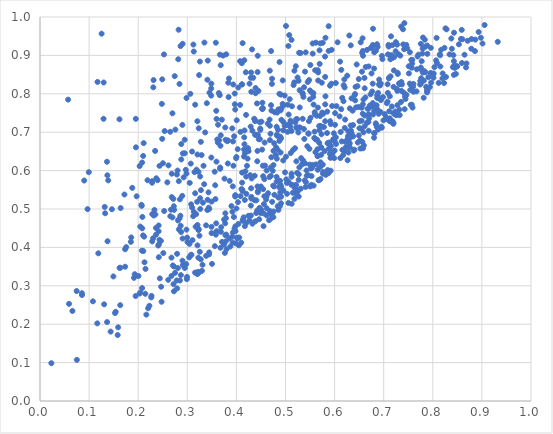
| Category | Series 0 |
|---|---|
| 0.3241826572381302 | 0.335 |
| 0.35943914082320505 | 0.623 |
| 0.7320326716899943 | 0.759 |
| 0.4909191485191038 | 0.515 |
| 0.7139500921506526 | 0.845 |
| 0.17553779853532225 | 0.401 |
| 0.543216185961203 | 0.587 |
| 0.7064448453857968 | 0.775 |
| 0.38278672243462475 | 0.679 |
| 0.30679952129831023 | 0.38 |
| 0.3169270997529283 | 0.454 |
| 0.5728964879675177 | 0.66 |
| 0.19294451869547558 | 0.33 |
| 0.7200454432876707 | 0.818 |
| 0.43267757560375997 | 0.462 |
| 0.5883850561728835 | 0.657 |
| 0.6134871844233055 | 0.76 |
| 0.3589021592761066 | 0.463 |
| 0.14386874915960468 | 0.181 |
| 0.4309821267858086 | 0.58 |
| 0.08540787262710192 | 0.281 |
| 0.36470227393187504 | 0.679 |
| 0.3494523866823751 | 0.437 |
| 0.06604621093850571 | 0.234 |
| 0.6846551922902698 | 0.72 |
| 0.6842214321963571 | 0.912 |
| 0.13662077026407937 | 0.206 |
| 0.6864666068234506 | 0.929 |
| 0.7134935111356105 | 0.899 |
| 0.27191063807600646 | 0.304 |
| 0.6588241501385045 | 0.785 |
| 0.5984386878877718 | 0.697 |
| 0.394934147082889 | 0.479 |
| 0.2902449224560274 | 0.365 |
| 0.43041418270860243 | 0.532 |
| 0.6257251340946023 | 0.847 |
| 0.7763490728289525 | 0.841 |
| 0.4819970509914826 | 0.572 |
| 0.09682463340321523 | 0.5 |
| 0.6518856142961246 | 0.678 |
| 0.7175616406374252 | 0.927 |
| 0.2683598522995426 | 0.531 |
| 0.30707401395662204 | 0.618 |
| 0.7284815163905518 | 0.746 |
| 0.7794407426993887 | 0.918 |
| 0.6039012955829326 | 0.768 |
| 0.3298055551551954 | 0.339 |
| 0.4545789864268118 | 0.585 |
| 0.4523891559498634 | 0.655 |
| 0.2362721393551751 | 0.451 |
| 0.2841078757293837 | 0.826 |
| 0.6776270733750223 | 0.826 |
| 0.5495888155398727 | 0.785 |
| 0.48573668738135845 | 0.53 |
| 0.24164016768497132 | 0.457 |
| 0.8487230886286082 | 0.872 |
| 0.5131702470108969 | 0.767 |
| 0.8377310728050598 | 0.944 |
| 0.7231327528418295 | 0.747 |
| 0.6426934928060217 | 0.818 |
| 0.44339780883575586 | 0.899 |
| 0.2827507910456427 | 0.447 |
| 0.23148482045482233 | 0.483 |
| 0.5866617593635869 | 0.672 |
| 0.6437193347377128 | 0.765 |
| 0.4583101829385514 | 0.613 |
| 0.652590495293859 | 0.658 |
| 0.5656036972357789 | 0.602 |
| 0.3853952361526052 | 0.423 |
| 0.21009920451461428 | 0.638 |
| 0.5409855531365229 | 0.557 |
| 0.8589589464240803 | 0.966 |
| 0.49117956500907334 | 0.532 |
| 0.5747755845747592 | 0.751 |
| 0.15821562117675259 | 0.172 |
| 0.6307564224063056 | 0.671 |
| 0.11708615925991162 | 0.831 |
| 0.47185384485158477 | 0.477 |
| 0.6215571550748945 | 0.733 |
| 0.5200947401573266 | 0.556 |
| 0.6855784723082043 | 0.77 |
| 0.4459318768912177 | 0.553 |
| 0.2488530643220146 | 0.683 |
| 0.6229684678610061 | 0.661 |
| 0.6883439693966587 | 0.755 |
| 0.6985694362016511 | 0.791 |
| 0.8084421023379886 | 0.88 |
| 0.46906283870365917 | 0.49 |
| 0.5846668293358934 | 0.698 |
| 0.5857009786050621 | 0.671 |
| 0.7604939611074603 | 0.826 |
| 0.8280401748681426 | 0.968 |
| 0.5686999092051592 | 0.672 |
| 0.24896352705775648 | 0.838 |
| 0.3568733139873371 | 0.562 |
| 0.45701372724662914 | 0.533 |
| 0.43622897879704237 | 0.735 |
| 0.23499736599163967 | 0.486 |
| 0.4464250634227528 | 0.473 |
| 0.5349864197972677 | 0.735 |
| 0.2977862816877459 | 0.357 |
| 0.3145855473004784 | 0.596 |
| 0.7135110876023892 | 0.89 |
| 0.5704036988670822 | 0.742 |
| 0.7579384403388559 | 0.879 |
| 0.5901671333909653 | 0.673 |
| 0.7324927742681306 | 0.744 |
| 0.42160699653445677 | 0.612 |
| 0.3408274504015446 | 0.497 |
| 0.6608908827755022 | 0.841 |
| 0.29910390936076514 | 0.317 |
| 0.2859113534807829 | 0.483 |
| 0.4165477384243287 | 0.705 |
| 0.43255792780822666 | 0.704 |
| 0.2948810911885892 | 0.645 |
| 0.15291289288891463 | 0.229 |
| 0.5193951565545566 | 0.658 |
| 0.4616078856386605 | 0.502 |
| 0.8497440962434404 | 0.871 |
| 0.4303740629220062 | 0.805 |
| 0.536539827172495 | 0.792 |
| 0.20660107080165513 | 0.511 |
| 0.3441968549566693 | 0.382 |
| 0.4705259441677424 | 0.77 |
| 0.726283129269042 | 0.751 |
| 0.5552594698605303 | 0.615 |
| 0.56860413019261 | 0.716 |
| 0.3078456778790343 | 0.512 |
| 0.4749830565842864 | 0.561 |
| 0.12968161475220374 | 0.829 |
| 0.1913835749504963 | 0.321 |
| 0.6061062655337774 | 0.934 |
| 0.44860766155624077 | 0.71 |
| 0.5047891168790143 | 0.772 |
| 0.5693094462080407 | 0.913 |
| 0.2612154428986535 | 0.316 |
| 0.7569943837092026 | 0.868 |
| 0.2877645338291288 | 0.629 |
| 0.42999779824606055 | 0.855 |
| 0.6930575016696245 | 0.753 |
| 0.7864862674998488 | 0.818 |
| 0.7050975734124593 | 0.734 |
| 0.5220633586517358 | 0.713 |
| 0.23957755193304864 | 0.575 |
| 0.7352292083773888 | 0.779 |
| 0.5307488198779351 | 0.906 |
| 0.41612105644409214 | 0.887 |
| 0.5506362305098268 | 0.875 |
| 0.5906039390142854 | 0.821 |
| 0.32113508124688916 | 0.332 |
| 0.3131842646988878 | 0.493 |
| 0.3676109879234828 | 0.665 |
| 0.4291279825481712 | 0.715 |
| 0.6739326111744868 | 0.92 |
| 0.5501423431132537 | 0.559 |
| 0.5117547141331752 | 0.563 |
| 0.5209696768910705 | 0.872 |
| 0.39269639092047137 | 0.439 |
| 0.3935725408947701 | 0.824 |
| 0.43906726993847944 | 0.815 |
| 0.5239658617765203 | 0.547 |
| 0.6886446685259877 | 0.802 |
| 0.6309803259798191 | 0.762 |
| 0.12546493012421112 | 0.957 |
| 0.2793576031691365 | 0.293 |
| 0.5267768751296757 | 0.576 |
| 0.32276687803356596 | 0.445 |
| 0.41263237281253373 | 0.932 |
| 0.23130438620122873 | 0.836 |
| 0.4171099453574988 | 0.523 |
| 0.334854104228515 | 0.933 |
| 0.44291865836082944 | 0.559 |
| 0.4700622055795819 | 0.586 |
| 0.5923596805880003 | 0.664 |
| 0.5221343931347345 | 0.624 |
| 0.8149126940895356 | 0.9 |
| 0.8676908987760715 | 0.869 |
| 0.47143996782322417 | 0.756 |
| 0.6366799312255437 | 0.756 |
| 0.6866290571697985 | 0.796 |
| 0.6812924699597956 | 0.697 |
| 0.4294815236345402 | 0.483 |
| 0.21284072983722113 | 0.361 |
| 0.26779261023095435 | 0.373 |
| 0.4913186301863245 | 0.559 |
| 0.4131008961982351 | 0.472 |
| 0.5524088936581311 | 0.561 |
| 0.35925855978800336 | 0.441 |
| 0.5795788457602404 | 0.651 |
| 0.2307482590133605 | 0.817 |
| 0.7110427925715185 | 0.842 |
| 0.6733299772849143 | 0.768 |
| 0.6000489418035074 | 0.652 |
| 0.7052556085671682 | 0.738 |
| 0.3206191841171625 | 0.642 |
| 0.6101345654715006 | 0.741 |
| 0.2843270986036993 | 0.476 |
| 0.32328485444616195 | 0.71 |
| 0.4943026595746979 | 0.835 |
| 0.41126079811931426 | 0.825 |
| 0.753315874642528 | 0.908 |
| 0.8268022229061012 | 0.844 |
| 0.5695989068954492 | 0.878 |
| 0.3227924348818557 | 0.597 |
| 0.16372174627160463 | 0.347 |
| 0.5265918423639195 | 0.834 |
| 0.1372120218635723 | 0.588 |
| 0.5878526564673584 | 0.976 |
| 0.09937276154655517 | 0.596 |
| 0.5592054253627353 | 0.701 |
| 0.5706713917043384 | 0.931 |
| 0.49007021191128375 | 0.757 |
| 0.6692722724264102 | 0.747 |
| 0.5063580355874711 | 0.57 |
| 0.5540058314655582 | 0.611 |
| 0.47281200208135676 | 0.519 |
| 0.6328623902945344 | 0.926 |
| 0.6350933942993762 | 0.692 |
| 0.6838543954463874 | 0.723 |
| 0.25286506445130086 | 0.495 |
| 0.3967972019018391 | 0.773 |
| 0.6171857456408648 | 0.64 |
| 0.7893406266849216 | 0.808 |
| 0.40373998124124777 | 0.816 |
| 0.7362043272267517 | 0.808 |
| 0.417460147173228 | 0.645 |
| 0.21490514222184343 | 0.344 |
| 0.7446548253464573 | 0.919 |
| 0.6402561556451217 | 0.655 |
| 0.637908081725462 | 0.689 |
| 0.8068449401306811 | 0.887 |
| 0.34097475467742466 | 0.837 |
| 0.05913192137283163 | 0.253 |
| 0.5086171319150498 | 0.786 |
| 0.775653661250402 | 0.869 |
| 0.6206575907134803 | 0.711 |
| 0.6531479664896472 | 0.934 |
| 0.6300182538397123 | 0.67 |
| 0.5268949635798933 | 0.532 |
| 0.5529142132754882 | 0.563 |
| 0.6778593471768933 | 0.776 |
| 0.5636938347431009 | 0.743 |
| 0.48277191709637635 | 0.691 |
| 0.5642276067475817 | 0.68 |
| 0.4884770725136859 | 0.507 |
| 0.38350892277700843 | 0.829 |
| 0.695003581887999 | 0.714 |
| 0.8442462063230808 | 0.874 |
| 0.2079124518885045 | 0.294 |
| 0.602460678755261 | 0.828 |
| 0.7884859155847298 | 0.926 |
| 0.8409640050778232 | 0.869 |
| 0.4960788861695947 | 0.77 |
| 0.7582327751080475 | 0.888 |
| 0.3939131081039642 | 0.613 |
| 0.8933760427127276 | 0.961 |
| 0.7795007914380815 | 0.855 |
| 0.3747208256456246 | 0.407 |
| 0.5949057224382441 | 0.768 |
| 0.680511136643269 | 0.756 |
| 0.0854729130338393 | 0.276 |
| 0.8077140862419002 | 0.946 |
| 0.33433252473268915 | 0.565 |
| 0.29256988508935977 | 0.582 |
| 0.4498728907601225 | 0.559 |
| 0.30621024241046635 | 0.8 |
| 0.6465334255306514 | 0.82 |
| 0.6694013405060258 | 0.871 |
| 0.5249591389600544 | 0.546 |
| 0.37799632894521773 | 0.68 |
| 0.7311127177084753 | 0.827 |
| 0.7397303236541029 | 0.929 |
| 0.40408319135985216 | 0.461 |
| 0.3160529803096931 | 0.772 |
| 0.5075548657833875 | 0.953 |
| 0.6272505175626626 | 0.69 |
| 0.3626335562831685 | 0.719 |
| 0.8388760494513026 | 0.917 |
| 0.27885094745790395 | 0.59 |
| 0.7674192600343356 | 0.864 |
| 0.19686821602242988 | 0.533 |
| 0.411125689455872 | 0.88 |
| 0.7207072321551181 | 0.861 |
| 0.5554244517903073 | 0.905 |
| 0.7359351642296017 | 0.831 |
| 0.4752097624676991 | 0.479 |
| 0.3099358922215333 | 0.504 |
| 0.4425250402281449 | 0.624 |
| 0.7421319664029522 | 0.984 |
| 0.5879147553852088 | 0.912 |
| 0.7101037655396252 | 0.923 |
| 0.7371473705094705 | 0.825 |
| 0.4766615689275685 | 0.559 |
| 0.20994788868430925 | 0.431 |
| 0.7462732945667572 | 0.797 |
| 0.5573031830230819 | 0.561 |
| 0.19512030075412068 | 0.735 |
| 0.3982768869689567 | 0.442 |
| 0.32759254266885385 | 0.675 |
| 0.45299232488315777 | 0.777 |
| 0.7690020899365447 | 0.897 |
| 0.7166821501762789 | 0.767 |
| 0.5347612596211855 | 0.802 |
| 0.338356043714501 | 0.378 |
| 0.7392681590122667 | 0.968 |
| 0.3825120532884245 | 0.618 |
| 0.5185583313974145 | 0.555 |
| 0.6304010686127697 | 0.683 |
| 0.131808998929002 | 0.505 |
| 0.6858784999790126 | 0.714 |
| 0.5486911654764632 | 0.657 |
| 0.39127183856497505 | 0.428 |
| 0.5103103430122872 | 0.73 |
| 0.3225430230508126 | 0.373 |
| 0.690789979891059 | 0.837 |
| 0.3330390686740966 | 0.613 |
| 0.1618111530163704 | 0.734 |
| 0.3232517382836705 | 0.448 |
| 0.4841185262896448 | 0.507 |
| 0.3680540747260662 | 0.874 |
| 0.13894354113995466 | 0.575 |
| 0.7185959294069068 | 0.894 |
| 0.6688420874898616 | 0.727 |
| 0.5374797511756442 | 0.708 |
| 0.46760360118619837 | 0.733 |
| 0.4000780190106329 | 0.635 |
| 0.6546696479941618 | 0.709 |
| 0.5151406460060094 | 0.653 |
| 0.42992785009357937 | 0.554 |
| 0.5411583604273776 | 0.908 |
| 0.37730755327250254 | 0.712 |
| 0.16339868635354893 | 0.25 |
| 0.8784706471762369 | 0.917 |
| 0.5713281197783756 | 0.622 |
| 0.366924757643066 | 0.605 |
| 0.29493697061335744 | 0.346 |
| 0.6805042291462351 | 0.866 |
| 0.870919835700449 | 0.938 |
| 0.74602946659815 | 0.927 |
| 0.6886304900450099 | 0.792 |
| 0.34514371789125553 | 0.803 |
| 0.5236137779302414 | 0.734 |
| 0.41832115854342644 | 0.598 |
| 0.3689533467437003 | 0.453 |
| 0.3486923251644656 | 0.814 |
| 0.4552685351057354 | 0.455 |
| 0.3848850672019932 | 0.84 |
| 0.550954702668466 | 0.737 |
| 0.7125031135989341 | 0.794 |
| 0.226572469923097 | 0.27 |
| 0.5552887458031017 | 0.931 |
| 0.4893538446701875 | 0.543 |
| 0.2103753085356368 | 0.39 |
| 0.6752348189956813 | 0.853 |
| 0.6311723493540978 | 0.66 |
| 0.7707010039801919 | 0.902 |
| 0.5245659768714022 | 0.842 |
| 0.5215528782729706 | 0.563 |
| 0.35612560254668446 | 0.403 |
| 0.4448014931753629 | 0.807 |
| 0.49832596284565356 | 0.795 |
| 0.7814465036242374 | 0.79 |
| 0.3431561898185972 | 0.543 |
| 0.24819498347554236 | 0.774 |
| 0.8429869319736344 | 0.849 |
| 0.3974278436565687 | 0.532 |
| 0.5027507180268859 | 0.568 |
| 0.5010114754147222 | 0.977 |
| 0.6830292200331987 | 0.765 |
| 0.6612547507387139 | 0.814 |
| 0.39794958881958375 | 0.455 |
| 0.7773825892883481 | 0.885 |
| 0.6419474156336697 | 0.783 |
| 0.30495838297233235 | 0.568 |
| 0.6346847524604514 | 0.697 |
| 0.5530217365545915 | 0.804 |
| 0.44377314717712224 | 0.546 |
| 0.6612662537131418 | 0.743 |
| 0.20755291360863404 | 0.392 |
| 0.6876662607763678 | 0.922 |
| 0.8153410506233659 | 0.871 |
| 0.6009885584846272 | 0.75 |
| 0.7124571524094334 | 0.73 |
| 0.41162256275894604 | 0.569 |
| 0.46402587786816385 | 0.722 |
| 0.3782073168672344 | 0.416 |
| 0.24759576552771267 | 0.258 |
| 0.43866995775262063 | 0.731 |
| 0.645017866731952 | 0.876 |
| 0.32629622408212466 | 0.5 |
| 0.8418207192184112 | 0.901 |
| 0.5804607277575242 | 0.897 |
| 0.8200544097226119 | 0.853 |
| 0.2421569119221817 | 0.408 |
| 0.5281565347281575 | 0.608 |
| 0.5296742424873746 | 0.712 |
| 0.6671270568719713 | 0.761 |
| 0.7851283267957886 | 0.856 |
| 0.2419625297068616 | 0.374 |
| 0.45383319295794056 | 0.613 |
| 0.4574845882143873 | 0.673 |
| 0.5903556020625131 | 0.644 |
| 0.42073506264364746 | 0.465 |
| 0.16425908017115454 | 0.502 |
| 0.7252130544409023 | 0.744 |
| 0.6283790983053781 | 0.661 |
| 0.5814498615813374 | 0.793 |
| 0.4006440012780851 | 0.425 |
| 0.461532470928115 | 0.6 |
| 0.40744718243828615 | 0.771 |
| 0.6782856077017277 | 0.746 |
| 0.5768766094093962 | 0.748 |
| 0.23301733892035514 | 0.498 |
| 0.20815883797208035 | 0.45 |
| 0.8171028795196755 | 0.915 |
| 0.5999909803308551 | 0.677 |
| 0.35809316034888916 | 0.933 |
| 0.5223149667047342 | 0.539 |
| 0.677697096508856 | 0.924 |
| 0.7550100687673137 | 0.771 |
| 0.3923219630964432 | 0.413 |
| 0.8018299687540962 | 0.853 |
| 0.4855912146414102 | 0.498 |
| 0.7882679855347448 | 0.804 |
| 0.5466017073949587 | 0.697 |
| 0.6939918869894403 | 0.827 |
| 0.6029623163527079 | 0.669 |
| 0.5427943955074664 | 0.6 |
| 0.7433512772809546 | 0.793 |
| 0.8686443108159706 | 0.879 |
| 0.41163360953336214 | 0.824 |
| 0.13061796897009104 | 0.252 |
| 0.6717190635514423 | 0.77 |
| 0.48754537456145675 | 0.677 |
| 0.4606306216524778 | 0.525 |
| 0.5860032402425951 | 0.601 |
| 0.4502770509323626 | 0.498 |
| 0.5277260087119784 | 0.907 |
| 0.37023482770519667 | 0.733 |
| 0.7939714271715641 | 0.818 |
| 0.36838221094351775 | 0.441 |
| 0.5617983602792908 | 0.616 |
| 0.4826138546945714 | 0.693 |
| 0.2731197012637647 | 0.498 |
| 0.4420679361819063 | 0.775 |
| 0.5920140381149251 | 0.6 |
| 0.7741916423451183 | 0.824 |
| 0.7820629223843678 | 0.857 |
| 0.2869093643114191 | 0.328 |
| 0.509270185982445 | 0.723 |
| 0.4494456622448596 | 0.49 |
| 0.9323227982563288 | 0.935 |
| 0.7281320610915831 | 0.771 |
| 0.7124270372649837 | 0.736 |
| 0.15911247539405182 | 0.192 |
| 0.5237101569204556 | 0.594 |
| 0.7599383021360125 | 0.818 |
| 0.5738809839905774 | 0.829 |
| 0.6507016418011673 | 0.728 |
| 0.3502954521042888 | 0.357 |
| 0.8646523051619714 | 0.902 |
| 0.665613196138127 | 0.724 |
| 0.44040800398820623 | 0.489 |
| 0.39872219346559334 | 0.411 |
| 0.3159987083983107 | 0.541 |
| 0.5723738860607255 | 0.661 |
| 0.4612927367947147 | 0.533 |
| 0.45221063457087585 | 0.761 |
| 0.3105739007361453 | 0.419 |
| 0.13757301999534066 | 0.416 |
| 0.628206225970987 | 0.647 |
| 0.49005699143174275 | 0.647 |
| 0.8257804629126957 | 0.97 |
| 0.37718955767492435 | 0.463 |
| 0.6763426391687344 | 0.768 |
| 0.2539512737475095 | 0.703 |
| 0.565093919716192 | 0.656 |
| 0.48892997620601497 | 0.573 |
| 0.5390097856034715 | 0.574 |
| 0.6579020145173474 | 0.899 |
| 0.408228475700383 | 0.701 |
| 0.2807586949384643 | 0.346 |
| 0.5782422844781434 | 0.713 |
| 0.1953779280698399 | 0.661 |
| 0.8429826503613439 | 0.885 |
| 0.5288286089497488 | 0.809 |
| 0.39264157956561496 | 0.559 |
| 0.6913720021676366 | 0.752 |
| 0.6116281433475123 | 0.632 |
| 0.5042090027958444 | 0.701 |
| 0.8787085369957905 | 0.943 |
| 0.7298699616632489 | 0.903 |
| 0.7587719458331076 | 0.764 |
| 0.3793166167072466 | 0.903 |
| 0.7018875331770223 | 0.747 |
| 0.2983140836540593 | 0.446 |
| 0.3261877227235602 | 0.585 |
| 0.5231603130809983 | 0.711 |
| 0.5181567339708902 | 0.86 |
| 0.5529527331406918 | 0.586 |
| 0.6588718551874492 | 0.7 |
| 0.2043023467409124 | 0.282 |
| 0.49096237129320586 | 0.684 |
| 0.6806930646595373 | 0.908 |
| 0.33834074717032825 | 0.457 |
| 0.7818480147963189 | 0.834 |
| 0.355734157950342 | 0.597 |
| 0.6185731207960079 | 0.822 |
| 0.5538018022065058 | 0.607 |
| 0.6561269005671186 | 0.907 |
| 0.7248766958577919 | 0.935 |
| 0.5383546029737747 | 0.682 |
| 0.8195337146910057 | 0.84 |
| 0.4878953868783984 | 0.883 |
| 0.4128965929910363 | 0.469 |
| 0.46133957283470106 | 0.483 |
| 0.5808625722815848 | 0.729 |
| 0.32743322097247585 | 0.369 |
| 0.46743626209423483 | 0.583 |
| 0.405030691841349 | 0.405 |
| 0.6779682057417367 | 0.927 |
| 0.4381145790428048 | 0.693 |
| 0.6492756679494986 | 0.691 |
| 0.6197962403815068 | 0.837 |
| 0.46652841660553024 | 0.471 |
| 0.2827197945570781 | 0.572 |
| 0.3675875449639662 | 0.399 |
| 0.6627983676811453 | 0.791 |
| 0.39301131966820313 | 0.676 |
| 0.626520046592312 | 0.627 |
| 0.34167499228294285 | 0.886 |
| 0.6309348317729877 | 0.692 |
| 0.23026141295671843 | 0.424 |
| 0.43959406921669963 | 0.693 |
| 0.11875145676457854 | 0.385 |
| 0.551706647252444 | 0.605 |
| 0.4818911585204402 | 0.714 |
| 0.8447445027342929 | 0.867 |
| 0.6136078197455909 | 0.862 |
| 0.47814380915146737 | 0.752 |
| 0.6155769681920386 | 0.789 |
| 0.4681274189082535 | 0.717 |
| 0.12939753238999663 | 0.735 |
| 0.7881448251064287 | 0.809 |
| 0.41156834452680013 | 0.595 |
| 0.8014188689874869 | 0.842 |
| 0.482960975895912 | 0.751 |
| 0.3589371626843785 | 0.756 |
| 0.33185834961131644 | 0.516 |
| 0.526207757912858 | 0.699 |
| 0.6506170129273406 | 0.71 |
| 0.24337696759665284 | 0.612 |
| 0.2651324801256171 | 0.701 |
| 0.2462185083318853 | 0.417 |
| 0.6334124265627941 | 0.704 |
| 0.6961128455060047 | 0.712 |
| 0.39544606717806663 | 0.689 |
| 0.4874997095331245 | 0.556 |
| 0.44315811613417 | 0.857 |
| 0.8432147800084427 | 0.959 |
| 0.36109104808078674 | 0.681 |
| 0.3413353057184355 | 0.524 |
| 0.40263710654727003 | 0.656 |
| 0.37576270188058447 | 0.579 |
| 0.5691103717625193 | 0.705 |
| 0.6572602106906857 | 0.748 |
| 0.3572835752922736 | 0.526 |
| 0.4684286203562674 | 0.495 |
| 0.17197958223763332 | 0.538 |
| 0.4711258153754705 | 0.635 |
| 0.48922150761272176 | 0.688 |
| 0.42683592100455037 | 0.47 |
| 0.41195091599793576 | 0.55 |
| 0.4243961749428554 | 0.482 |
| 0.27285657981978495 | 0.286 |
| 0.34453169999585065 | 0.387 |
| 0.26677973815189715 | 0.498 |
| 0.5586558608231079 | 0.685 |
| 0.6868693493795077 | 0.789 |
| 0.34930503952483494 | 0.453 |
| 0.2110843709829361 | 0.671 |
| 0.36206525398279166 | 0.673 |
| 0.7836926360378685 | 0.941 |
| 0.5758813407676185 | 0.933 |
| 0.2750668527370852 | 0.334 |
| 0.47548972761932196 | 0.651 |
| 0.6578282581534093 | 0.658 |
| 0.5763187822629068 | 0.592 |
| 0.6942751728749936 | 0.783 |
| 0.2984778150266164 | 0.592 |
| 0.4102709714016164 | 0.552 |
| 0.47064207360043786 | 0.911 |
| 0.5318869213503089 | 0.632 |
| 0.5464372687223304 | 0.588 |
| 0.4757623383995069 | 0.493 |
| 0.372955056459108 | 0.9 |
| 0.3994110101954408 | 0.632 |
| 0.49903457856310796 | 0.595 |
| 0.7179080757257729 | 0.729 |
| 0.18583024489327438 | 0.426 |
| 0.49535741954569257 | 0.626 |
| 0.5612166540379214 | 0.682 |
| 0.5418008982928676 | 0.57 |
| 0.7605998759407443 | 0.805 |
| 0.2085281209095442 | 0.479 |
| 0.8033207788830936 | 0.869 |
| 0.2896949626458518 | 0.534 |
| 0.4836979210743335 | 0.655 |
| 0.5494383011190269 | 0.616 |
| 0.5732873081550401 | 0.695 |
| 0.30449227984491667 | 0.409 |
| 0.3748936802625099 | 0.472 |
| 0.443676037611373 | 0.544 |
| 0.2678188881872433 | 0.326 |
| 0.41719256041585373 | 0.455 |
| 0.4007123549960442 | 0.731 |
| 0.298393573703726 | 0.789 |
| 0.05725220090629579 | 0.785 |
| 0.21658734537513324 | 0.225 |
| 0.680458383879148 | 0.698 |
| 0.7478971695287421 | 0.919 |
| 0.20423868648593113 | 0.454 |
| 0.9054258949074668 | 0.979 |
| 0.2654012649369687 | 0.481 |
| 0.77996221177251 | 0.947 |
| 0.575934964942985 | 0.616 |
| 0.2908852059270941 | 0.354 |
| 0.32076410540056943 | 0.458 |
| 0.6896218235914323 | 0.748 |
| 0.290443994543213 | 0.93 |
| 0.44871236395739034 | 0.706 |
| 0.4227949060961216 | 0.631 |
| 0.5377292513552794 | 0.817 |
| 0.6690597370360164 | 0.761 |
| 0.4304162189746278 | 0.527 |
| 0.5016502013295107 | 0.577 |
| 0.5164166717692039 | 0.562 |
| 0.7148886509407952 | 0.95 |
| 0.5766961073927064 | 0.596 |
| 0.5808013542221581 | 0.844 |
| 0.7960037878984261 | 0.92 |
| 0.3097085429087265 | 0.65 |
| 0.27438220793317347 | 0.846 |
| 0.4126933737539916 | 0.547 |
| 0.5973827265368008 | 0.682 |
| 0.4380873053820439 | 0.729 |
| 0.25935412955684334 | 0.569 |
| 0.7530404704356326 | 0.827 |
| 0.8341418729237168 | 0.903 |
| 0.24667885742518236 | 0.298 |
| 0.5814209995985122 | 0.946 |
| 0.728703963004157 | 0.852 |
| 0.1947472822353845 | 0.273 |
| 0.20050248269703697 | 0.326 |
| 0.2080177480760863 | 0.621 |
| 0.4248432787442682 | 0.651 |
| 0.40755259869253946 | 0.885 |
| 0.7242732031171868 | 0.911 |
| 0.7331351755799541 | 0.825 |
| 0.796591404458396 | 0.829 |
| 0.5565249530741597 | 0.792 |
| 0.31237569443804236 | 0.928 |
| 0.4892703406232878 | 0.56 |
| 0.5469176569618064 | 0.696 |
| 0.10781206996294646 | 0.26 |
| 0.39620104825491487 | 0.449 |
| 0.07509307518521702 | 0.107 |
| 0.3490070381056174 | 0.826 |
| 0.559742152139527 | 0.747 |
| 0.7158660947556966 | 0.901 |
| 0.3898928732589094 | 0.508 |
| 0.6901376089338168 | 0.824 |
| 0.319647761371901 | 0.334 |
| 0.15416965053557474 | 0.232 |
| 0.7077698151075661 | 0.78 |
| 0.4372726285383507 | 0.587 |
| 0.4192362569036764 | 0.856 |
| 0.6145026711947698 | 0.676 |
| 0.4868316215412015 | 0.574 |
| 0.2415516764955159 | 0.442 |
| 0.6159017375125917 | 0.654 |
| 0.7124409117482944 | 0.729 |
| 0.2802327446774787 | 0.6 |
| 0.7214696015059379 | 0.896 |
| 0.6925082698739032 | 0.822 |
| 0.41966322175190196 | 0.745 |
| 0.5939814296860534 | 0.915 |
| 0.6564765855296688 | 0.675 |
| 0.3965635328955579 | 0.801 |
| 0.4001513852719547 | 0.501 |
| 0.6489614121540569 | 0.766 |
| 0.3119593181917185 | 0.481 |
| 0.7513434092442205 | 0.853 |
| 0.22853271309970058 | 0.416 |
| 0.7788248637944324 | 0.905 |
| 0.31870765087646535 | 0.602 |
| 0.37936493208678623 | 0.433 |
| 0.207152243554941 | 0.508 |
| 0.28994841957643425 | 0.719 |
| 0.7273507198434759 | 0.928 |
| 0.5910768177973901 | 0.729 |
| 0.7112700539764586 | 0.755 |
| 0.6659666070695278 | 0.914 |
| 0.6300292488409538 | 0.952 |
| 0.3765085777227162 | 0.386 |
| 0.37753270847775333 | 0.432 |
| 0.3916242260419648 | 0.71 |
| 0.2849108633926134 | 0.525 |
| 0.32164690727137923 | 0.336 |
| 0.7227150136821714 | 0.749 |
| 0.3494215628039674 | 0.519 |
| 0.2877729234985794 | 0.669 |
| 0.38624165761146845 | 0.573 |
| 0.36610490619237257 | 0.796 |
| 0.5991221253688341 | 0.633 |
| 0.5822525090171967 | 0.589 |
| 0.43912423797905986 | 0.801 |
| 0.8237682917004241 | 0.92 |
| 0.6316330652325297 | 0.699 |
| 0.42672655762052414 | 0.826 |
| 0.7757316862997995 | 0.93 |
| 0.7410497010855623 | 0.803 |
| 0.17333119481142256 | 0.395 |
| 0.4237083576271262 | 0.659 |
| 0.4198964633743283 | 0.584 |
| 0.2822998475472571 | 0.967 |
| 0.5659951199426815 | 0.764 |
| 0.34893653094814936 | 0.634 |
| 0.7561024062579181 | 0.888 |
| 0.741586946294468 | 0.916 |
| 0.30031474580382755 | 0.414 |
| 0.5915059989054525 | 0.633 |
| 0.45687850746076586 | 0.578 |
| 0.303859211736495 | 0.374 |
| 0.6376576385995343 | 0.719 |
| 0.7426817448624468 | 0.76 |
| 0.6732760619806283 | 0.799 |
| 0.7281790899852553 | 0.855 |
| 0.16207592903032342 | 0.347 |
| 0.5850263092544447 | 0.754 |
| 0.5497813501258245 | 0.809 |
| 0.7097183603407881 | 0.927 |
| 0.6492053552982519 | 0.838 |
| 0.3261428782684078 | 0.528 |
| 0.42943198023670925 | 0.509 |
| 0.22281951957572832 | 0.248 |
| 0.2864781194461923 | 0.456 |
| 0.5808833454617622 | 0.772 |
| 0.5181883696383095 | 0.527 |
| 0.4822599096135234 | 0.631 |
| 0.2616578575075099 | 0.614 |
| 0.21445466339985608 | 0.279 |
| 0.37998734305193926 | 0.395 |
| 0.571322919802265 | 0.578 |
| 0.6415496361248948 | 0.799 |
| 0.4726614466857675 | 0.839 |
| 0.6123695606422067 | 0.701 |
| 0.7277268743641537 | 0.808 |
| 0.4773866759076655 | 0.537 |
| 0.3205496481729304 | 0.728 |
| 0.8593891795986377 | 0.88 |
| 0.2792122623377321 | 0.383 |
| 0.4645646819162934 | 0.541 |
| 0.023169592853284127 | 0.098 |
| 0.6995602607288746 | 0.731 |
| 0.41639966832208564 | 0.669 |
| 0.447103268213779 | 0.503 |
| 0.6694542564801224 | 0.704 |
| 0.44780227185439225 | 0.682 |
| 0.6758587147251571 | 0.92 |
| 0.3240679758353536 | 0.849 |
| 0.3179811653750483 | 0.487 |
| 0.853193827865988 | 0.929 |
| 0.3201481804886348 | 0.331 |
| 0.6344785734742577 | 0.788 |
| 0.45346223592772394 | 0.76 |
| 0.32564279943052965 | 0.884 |
| 0.5683540500378971 | 0.575 |
| 0.5098603244423123 | 0.714 |
| 0.44247883333896976 | 0.496 |
| 0.40327977577331786 | 0.518 |
| 0.46799734324990294 | 0.86 |
| 0.20294633482168023 | 0.28 |
| 0.18792947990391407 | 0.555 |
| 0.38410556707945787 | 0.792 |
| 0.5673937379612819 | 0.575 |
| 0.4858273355107776 | 0.53 |
| 0.37874134808113746 | 0.476 |
| 0.7086573700129629 | 0.903 |
| 0.5024660369461472 | 0.718 |
| 0.27252752462647334 | 0.35 |
| 0.678216403584221 | 0.969 |
| 0.4818339408361969 | 0.584 |
| 0.38118949184292683 | 0.676 |
| 0.716877632873382 | 0.726 |
| 0.46950266078851133 | 0.696 |
| 0.6388114522468236 | 0.652 |
| 0.7510124103097598 | 0.872 |
| 0.5178925267614359 | 0.83 |
| 0.6634223194783059 | 0.87 |
| 0.516480880102394 | 0.823 |
| 0.6574493421999367 | 0.773 |
| 0.2698405501297043 | 0.478 |
| 0.44369011367358047 | 0.693 |
| 0.3247655379767005 | 0.43 |
| 0.32903774830035715 | 0.64 |
| 0.17339676861715625 | 0.35 |
| 0.5922226477304713 | 0.721 |
| 0.49821283335900635 | 0.717 |
| 0.6326900022248102 | 0.717 |
| 0.29979068915798734 | 0.426 |
| 0.5620204210295721 | 0.933 |
| 0.5717681413593174 | 0.716 |
| 0.5289902126570051 | 0.764 |
| 0.4154575066804207 | 0.637 |
| 0.7540560783614033 | 0.81 |
| 0.27054877333210825 | 0.353 |
| 0.791075056944864 | 0.843 |
| 0.5610272900716081 | 0.648 |
| 0.3254713493472948 | 0.389 |
| 0.27567170720348433 | 0.707 |
| 0.27258053631740664 | 0.507 |
| 0.4740153878833261 | 0.6 |
| 0.5122188328390772 | 0.592 |
| 0.6214977276098587 | 0.675 |
| 0.8603585279265116 | 0.942 |
| 0.6963926664410058 | 0.899 |
| 0.45599894968516375 | 0.513 |
| 0.5954050397224181 | 0.644 |
| 0.4057921474524876 | 0.426 |
| 0.566225234995872 | 0.638 |
| 0.29696838654674507 | 0.602 |
| 0.3919048760061039 | 0.493 |
| 0.6111771113642094 | 0.884 |
| 0.37748280617188634 | 0.489 |
| 0.28158588151322783 | 0.89 |
| 0.556727553707099 | 0.802 |
| 0.07466313990145979 | 0.286 |
| 0.3977224849801557 | 0.536 |
| 0.43192459973217945 | 0.916 |
| 0.655146980791174 | 0.764 |
| 0.29467965738728363 | 0.68 |
| 0.8858830592019431 | 0.911 |
| 0.4292941071383841 | 0.842 |
| 0.26974413791361496 | 0.749 |
| 0.6278230184976704 | 0.702 |
| 0.5651425057283342 | 0.637 |
| 0.3158267871659083 | 0.334 |
| 0.2995402009856054 | 0.323 |
| 0.2201935670441546 | 0.242 |
| 0.494217962372306 | 0.774 |
| 0.7668965268000912 | 0.806 |
| 0.4371910249184956 | 0.523 |
| 0.42815967477368666 | 0.588 |
| 0.3681177637891888 | 0.692 |
| 0.32774341288032516 | 0.549 |
| 0.5707066199288618 | 0.609 |
| 0.5199614206668954 | 0.725 |
| 0.3486038844862568 | 0.795 |
| 0.370696097934301 | 0.414 |
| 0.4916644960982419 | 0.762 |
| 0.397627035392881 | 0.759 |
| 0.7337748025954809 | 0.899 |
| 0.5613782117980605 | 0.681 |
| 0.512543619334357 | 0.514 |
| 0.6886092608894013 | 0.707 |
| 0.47190433460697834 | 0.487 |
| 0.33983793737559087 | 0.776 |
| 0.22836973401568006 | 0.572 |
| 0.32008314305483976 | 0.519 |
| 0.4156174711398296 | 0.655 |
| 0.6860333739669586 | 0.761 |
| 0.25040404762764146 | 0.619 |
| 0.8228437825301192 | 0.828 |
| 0.23621969787738506 | 0.433 |
| 0.5216678659348202 | 0.734 |
| 0.5453319656294755 | 0.831 |
| 0.49550749095375135 | 0.705 |
| 0.5875501670577713 | 0.593 |
| 0.7197449024315166 | 0.722 |
| 0.4544486381656091 | 0.552 |
| 0.5934220772912387 | 0.826 |
| 0.5267250804118928 | 0.713 |
| 0.212033325112702 | 0.428 |
| 0.4536277777133969 | 0.763 |
| 0.7084417045482357 | 0.802 |
| 0.6180670721169703 | 0.781 |
| 0.7744544867847969 | 0.833 |
| 0.22865225020422697 | 0.487 |
| 0.5058858494951073 | 0.924 |
| 0.40977301473988026 | 0.412 |
| 0.4888093960837774 | 0.684 |
| 0.6203489240417772 | 0.817 |
| 0.2849601888476815 | 0.314 |
| 0.45550828206219396 | 0.489 |
| 0.8866108980430188 | 0.941 |
| 0.3596415286031065 | 0.734 |
| 0.5726773170945513 | 0.641 |
| 0.5122394428234189 | 0.703 |
| 0.4958441226291137 | 0.548 |
| 0.14648304906947107 | 0.499 |
| 0.22708782556543017 | 0.274 |
| 0.6701509791863145 | 0.736 |
| 0.8119755393076229 | 0.828 |
| 0.13272039838273608 | 0.489 |
| 0.5149067587883779 | 0.542 |
| 0.548048926548562 | 0.836 |
| 0.2524849065660594 | 0.902 |
| 0.719965829556652 | 0.749 |
| 0.5105699167803867 | 0.646 |
| 0.4022204326653067 | 0.424 |
| 0.3670500321178596 | 0.608 |
| 0.7888898704683132 | 0.904 |
| 0.40834858464262536 | 0.533 |
| 0.7079543905650292 | 0.825 |
| 0.5030287376875059 | 0.54 |
| 0.49579778301820365 | 0.726 |
| 0.6025514788321698 | 0.687 |
| 0.5603339949826808 | 0.861 |
| 0.7755026139158123 | 0.865 |
| 0.3877860814442835 | 0.402 |
| 0.3207446732881616 | 0.405 |
| 0.31318322811322064 | 0.91 |
| 0.5443932809165227 | 0.663 |
| 0.7196811619760329 | 0.725 |
| 0.4916520691520373 | 0.732 |
| 0.539955936964921 | 0.619 |
| 0.44560944402096025 | 0.682 |
| 0.7826255309493039 | 0.859 |
| 0.6803453023078345 | 0.686 |
| 0.21894960397791807 | 0.575 |
| 0.35994514559074786 | 0.442 |
| 0.723558560413351 | 0.754 |
| 0.5665504741363454 | 0.835 |
| 0.7571783443432821 | 0.772 |
| 0.26831537195689903 | 0.592 |
| 0.18508038375766578 | 0.414 |
| 0.2873134798886072 | 0.44 |
| 0.6204607449058014 | 0.65 |
| 0.4809027550541253 | 0.66 |
| 0.11670197531199022 | 0.202 |
| 0.8469994915463542 | 0.852 |
| 0.3309855181538659 | 0.355 |
| 0.7846667639997531 | 0.923 |
| 0.4202702265874203 | 0.539 |
| 0.44767874331465685 | 0.726 |
| 0.336440657060863 | 0.699 |
| 0.48050446466583685 | 0.641 |
| 0.6471418848841997 | 0.673 |
| 0.41591259598020447 | 0.687 |
| 0.5594917432452491 | 0.752 |
| 0.3447219787927571 | 0.5 |
| 0.5979175358835388 | 0.651 |
| 0.5123279276181031 | 0.584 |
| 0.8978945473203686 | 0.946 |
| 0.36629842602198137 | 0.902 |
| 0.23448272635860523 | 0.651 |
| 0.5397443922407403 | 0.858 |
| 0.6594762930036102 | 0.666 |
| 0.1364157875161468 | 0.623 |
| 0.4342867450766196 | 0.842 |
| 0.6973690108157398 | 0.89 |
| 0.36424667767411933 | 0.802 |
| 0.8006212753568686 | 0.851 |
| 0.4429255289600299 | 0.651 |
| 0.8142376726591515 | 0.903 |
| 0.2909099825644753 | 0.645 |
| 0.4147931896944378 | 0.478 |
| 0.7106877232112994 | 0.84 |
| 0.901263708938111 | 0.931 |
| 0.6557568606765607 | 0.858 |
| 0.5310428524482406 | 0.553 |
| 0.6408433335953576 | 0.797 |
| 0.7554238031753038 | 0.823 |
| 0.48763400587055983 | 0.8 |
| 0.2029117219677713 | 0.612 |
| 0.5064977736734405 | 0.746 |
| 0.5270957251716227 | 0.59 |
| 0.4723934641141574 | 0.826 |
| 0.676604501992625 | 0.806 |
| 0.6569778670489222 | 0.945 |
| 0.22836880095873457 | 0.568 |
| 0.4683361464421598 | 0.679 |
| 0.8573165178748856 | 0.943 |
| 0.7761229408725693 | 0.828 |
| 0.43862181715311466 | 0.468 |
| 0.243259806176937 | 0.42 |
| 0.14947951241733104 | 0.324 |
| 0.2782847112939981 | 0.314 |
| 0.5656831888737557 | 0.861 |
| 0.5478185739334648 | 0.729 |
| 0.6575191033774905 | 0.911 |
| 0.35816977367587455 | 0.433 |
| 0.49051557423687187 | 0.798 |
| 0.28103266872303334 | 0.47 |
| 0.24401623721862775 | 0.319 |
| 0.6008964131867887 | 0.719 |
| 0.2408196412470942 | 0.405 |
| 0.3084893816201766 | 0.381 |
| 0.5122045830591503 | 0.94 |
| 0.47542042224581194 | 0.614 |
| 0.27153349368943047 | 0.526 |
| 0.5571937853471277 | 0.772 |
| 0.655068342679763 | 0.73 |
| 0.5010616649913789 | 0.636 |
| 0.23686354604241744 | 0.58 |
| 0.2511206511274173 | 0.385 |
| 0.5059756348831432 | 0.516 |
| 0.48557638066645725 | 0.76 |
| 0.5358167182788147 | 0.626 |
| 0.48467845481879046 | 0.706 |
| 0.469764714930093 | 0.608 |
| 0.48929593390123227 | 0.564 |
| 0.44072927926917893 | 0.523 |
| 0.4768720116479084 | 0.671 |
| 0.566468251021787 | 0.856 |
| 0.735648294211849 | 0.975 |
| 0.28628413030783995 | 0.924 |
| 0.6266827457993626 | 0.683 |
| 0.2904178271454304 | 0.423 |
| 0.5349915647815869 | 0.8 |
| 0.7956844405593488 | 0.854 |
| 0.34367999921617887 | 0.504 |
| 0.45106993033212783 | 0.727 |
| 0.7269293069709778 | 0.813 |
| 0.7443831595292505 | 0.786 |
| 0.6612142330992903 | 0.715 |
| 0.533179063252173 | 0.616 |
| 0.09007110007988472 | 0.574 |